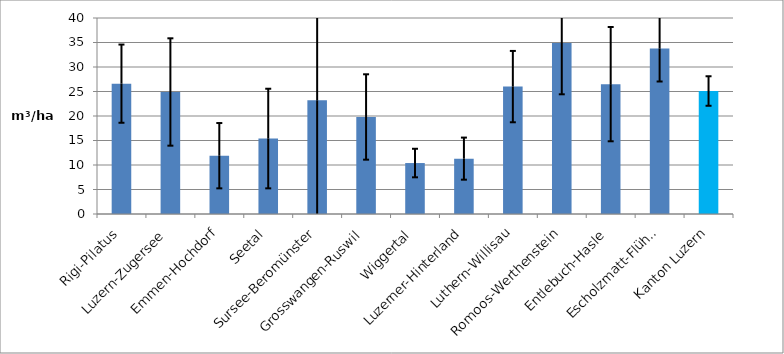
| Category | Series 0 |
|---|---|
| Rigi-Pilatus | 26.6 |
| Luzern-Zugersee | 24.9 |
| Emmen-Hochdorf | 11.9 |
| Seetal | 15.4 |
| Sursee-Beromünster | 23.2 |
| Grosswangen-Ruswil | 19.8 |
| Wiggertal | 10.4 |
| Luzerner-Hinterland | 11.3 |
| Luthern-Willisau | 26 |
| Romoos-Werthenstein | 34.9 |
| Entlebuch-Hasle | 26.5 |
| Escholzmatt-Flühli | 33.8 |
| Kanton Luzern | 25.1 |